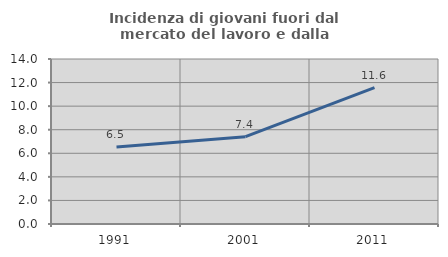
| Category | Incidenza di giovani fuori dal mercato del lavoro e dalla formazione  |
|---|---|
| 1991.0 | 6.543 |
| 2001.0 | 7.407 |
| 2011.0 | 11.576 |